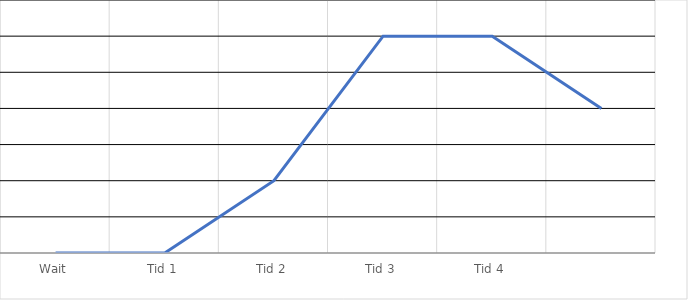
| Category | Series 0 |
|---|---|
| Wait | 0 |
| Tid 1 | 0 |
| Tid 2 | 1 |
| Tid 3 | 3 |
| Tid 4 | 3 |